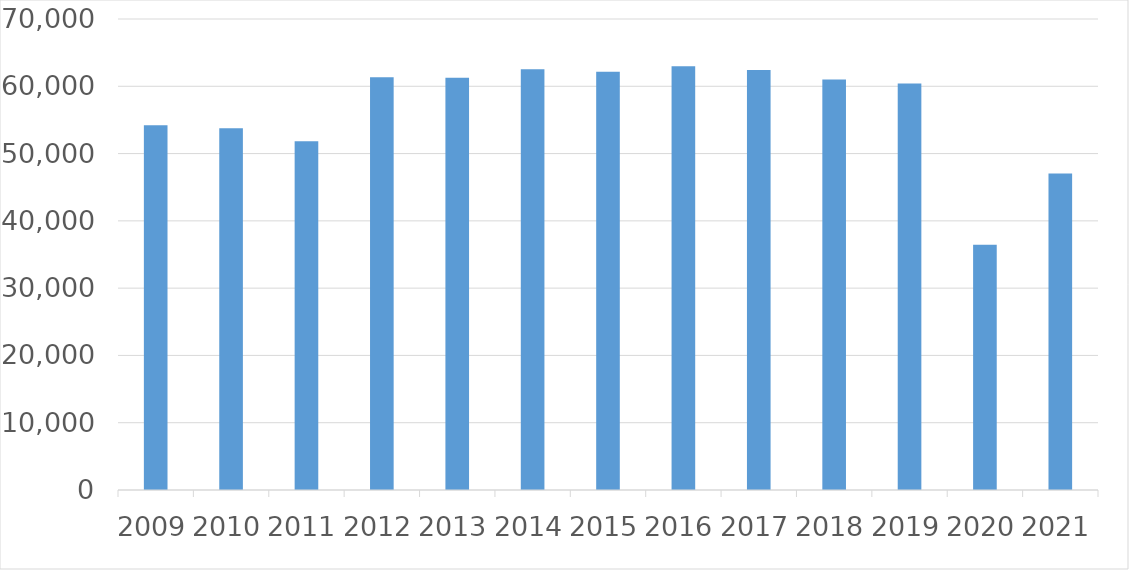
| Category | Series 0 |
|---|---|
| 2009 | 54194 |
| 2010 | 53747 |
| 2011 | 51832 |
| 2012 | 61331 |
| 2013 | 61259 |
| 2014 | 62521 |
| 2015 | 62157 |
| 2016 | 62969 |
| 2017 | 62402 |
| 2018 | 61014 |
| 2019 | 60424 |
| 2020 | 36442 |
| 2021 | 47032 |